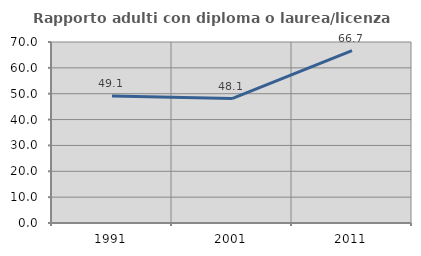
| Category | Rapporto adulti con diploma o laurea/licenza media  |
|---|---|
| 1991.0 | 49.105 |
| 2001.0 | 48.107 |
| 2011.0 | 66.667 |